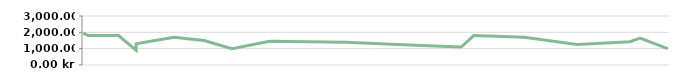
| Category | INTÄKT |
|---|---|
| 2013-04-23 | 1950 |
| 2013-04-25 | 1800 |
| 2013-05-07 | 1800 |
| 2013-05-14 | 900 |
| 2013-05-14 | 1300 |
| 2013-05-29 | 1700 |
| 2013-06-10 | 1500 |
| 2013-06-21 | 1000 |
| 2013-07-06 | 1450 |
| 2013-08-05 | 1400 |
| 2013-08-19 | 1300 |
| 2013-09-04 | 1200 |
| 2013-09-20 | 1100 |
| 2013-09-25 | 1800 |
| 2013-10-15 | 1700 |
| 2013-11-05 | 1250 |
| 2013-11-26 | 1425 |
| 2013-11-30 | 1650 |
| 2013-12-11 | 1000 |